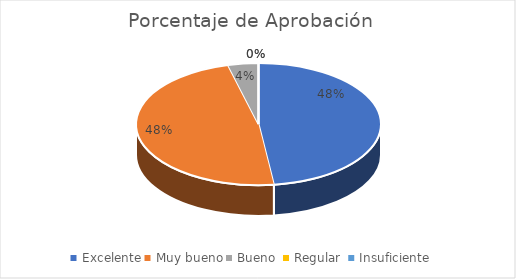
| Category | Porcentaje de Aprobación  |
|---|---|
| Excelente | 0.48 |
| Muy bueno | 0.48 |
| Bueno  | 0.04 |
| Regular  | 0 |
| Insuficiente | 0 |